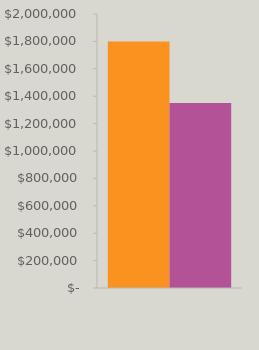
| Category | Income | Expenses |
|---|---|---|
| 0 | 1800000 | 1350000 |